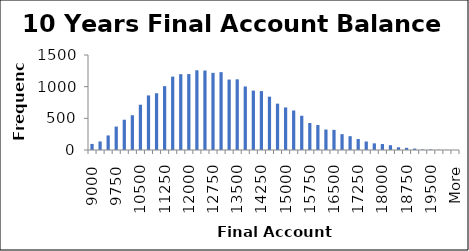
| Category | Frequency |
|---|---|
| 9000.0 | 96 |
| 9250.0 | 135 |
| 9500.0 | 230 |
| 9750.0 | 370 |
| 10000.0 | 478 |
| 10250.0 | 549 |
| 10500.0 | 715 |
| 10750.0 | 862 |
| 11000.0 | 896 |
| 11250.0 | 1008 |
| 11500.0 | 1159 |
| 11750.0 | 1197 |
| 12000.0 | 1199 |
| 12250.0 | 1259 |
| 12500.0 | 1255 |
| 12750.0 | 1218 |
| 13000.0 | 1229 |
| 13250.0 | 1112 |
| 13500.0 | 1116 |
| 13750.0 | 1003 |
| 14000.0 | 938 |
| 14250.0 | 930 |
| 14500.0 | 842 |
| 14750.0 | 732 |
| 15000.0 | 672 |
| 15250.0 | 624 |
| 15500.0 | 541 |
| 15750.0 | 426 |
| 16000.0 | 395 |
| 16250.0 | 323 |
| 16500.0 | 318 |
| 16750.0 | 250 |
| 17000.0 | 218 |
| 17250.0 | 174 |
| 17500.0 | 134 |
| 17750.0 | 105 |
| 18000.0 | 94 |
| 18250.0 | 76 |
| 18500.0 | 43 |
| 18750.0 | 34 |
| 19000.0 | 22 |
| 19250.0 | 8 |
| 19500.0 | 9 |
| 19750.0 | 4 |
| 20000.0 | 2 |
| More | 0 |